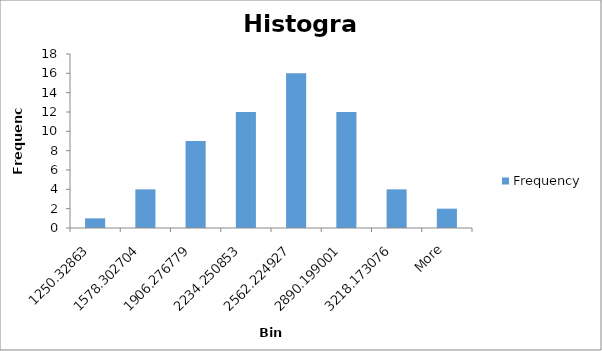
| Category | Frequency |
|---|---|
| 1250.32863 | 1 |
| 1578.302704 | 4 |
| 1906.276779 | 9 |
| 2234.250853 | 12 |
| 2562.224927 | 16 |
| 2890.199001 | 12 |
| 3218.173076 | 4 |
| More | 2 |